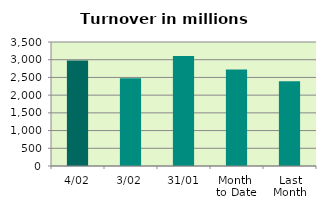
| Category | Series 0 |
|---|---|
| 4/02 | 2978.323 |
| 3/02 | 2474.806 |
| 31/01 | 3107.708 |
| Month 
to Date | 2726.565 |
| Last
Month | 2394.171 |